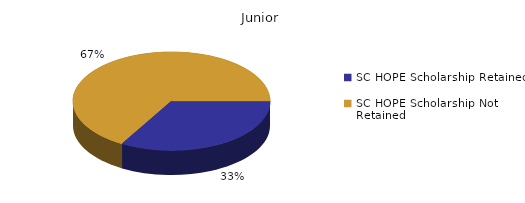
| Category | Junior |
|---|---|
| SC HOPE Scholarship Retained  | 1 |
| SC HOPE Scholarship Not Retained  | 2 |